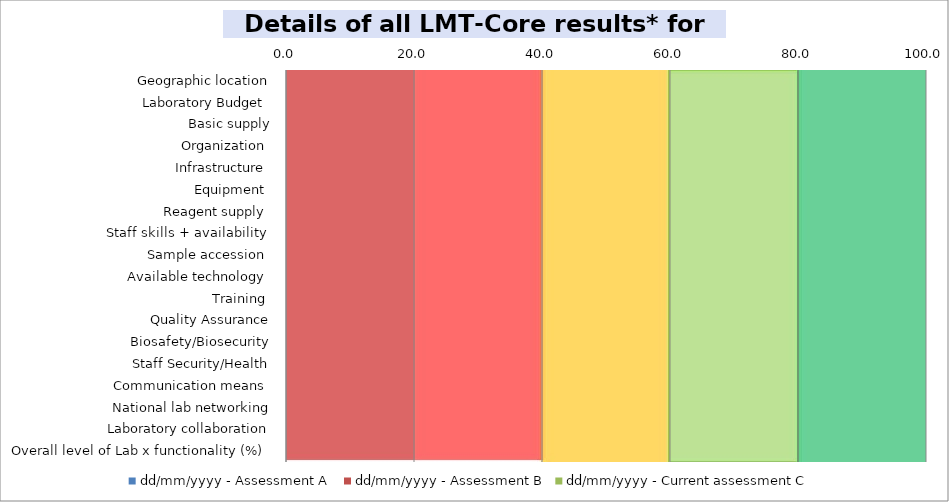
| Category | dd/mm/yyyy - Assessment A  | dd/mm/yyyy - Assessment B | dd/mm/yyyy - Current assessment C  |
|---|---|---|---|
| Geographic location | 0 | 0 | 0 |
| Laboratory Budget  | 0 | 0 | 0 |
| Basic supply | 0 | 0 | 0 |
| Organization  | 0 | 0 | 0 |
| Infrastructure  | 0 | 0 | 0 |
| Equipment  | 0 | 0 | 0 |
| Reagent supply  | 0 | 0 | 0 |
| Staff skills + availability  | 0 | 0 | 0 |
| Sample accession  | 0 | 0 | 0 |
| Available technology  | 0 | 0 | 0 |
| Training  | 0 | 0 | 0 |
| Quality Assurance | 0 | 0 | 0 |
| Biosafety/Biosecurity | 0 | 0 | 0 |
| Staff Security/Health | 0 | 0 | 0 |
| Communication means  | 0 | 0 | 0 |
| National lab networking | 0 | 0 | 0 |
| Laboratory collaboration | 0 | 0 | 0 |
| Overall level of Lab x functionality (%)  | 0 | 0 | 0 |